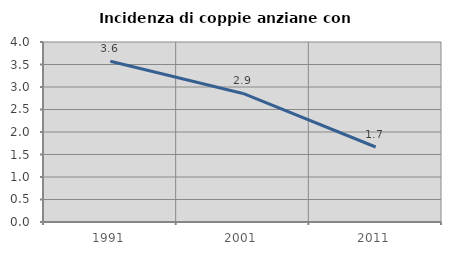
| Category | Incidenza di coppie anziane con figli |
|---|---|
| 1991.0 | 3.571 |
| 2001.0 | 2.857 |
| 2011.0 | 1.667 |